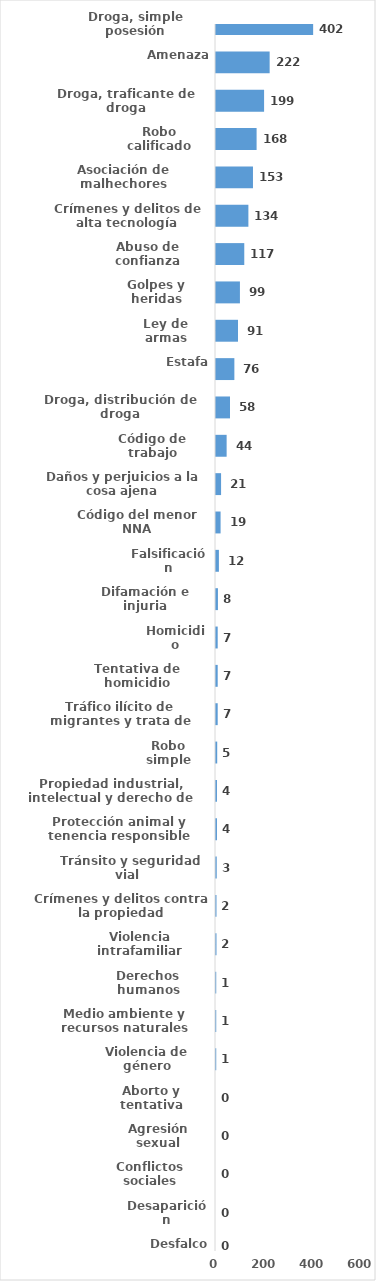
| Category | Series 0 |
|---|---|
| Droga, simple posesión | 402 |
| Amenaza | 222 |
| Droga, traficante de droga | 199 |
| Robo calificado | 168 |
| Asociación de malhechores | 153 |
| Crímenes y delitos de alta tecnología | 134 |
| Abuso de confianza | 117 |
| Golpes y heridas | 99 |
| Ley de armas | 91 |
| Estafa | 76 |
| Droga, distribución de droga | 58 |
| Código de trabajo | 44 |
| Daños y perjuicios a la cosa ajena | 21 |
| Código del menor NNA | 19 |
| Falsificación | 12 |
| Difamación e injuria | 8 |
| Homicidio | 7 |
| Tentativa de homicidio | 7 |
| Tráfico ilícito de migrantes y trata de personas | 7 |
| Robo simple | 5 |
| Propiedad industrial, intelectual y derecho de autor | 4 |
| Protección animal y tenencia responsible | 4 |
| Tránsito y seguridad vial  | 3 |
| Crímenes y delitos contra la propiedad | 2 |
| Violencia intrafamiliar | 2 |
| Derechos humanos | 1 |
| Medio ambiente y recursos naturales | 1 |
| Violencia de género | 1 |
| Aborto y tentativa | 0 |
| Agresión sexual | 0 |
| Conflictos sociales | 0 |
| Desaparición | 0 |
| Desfalco | 0 |